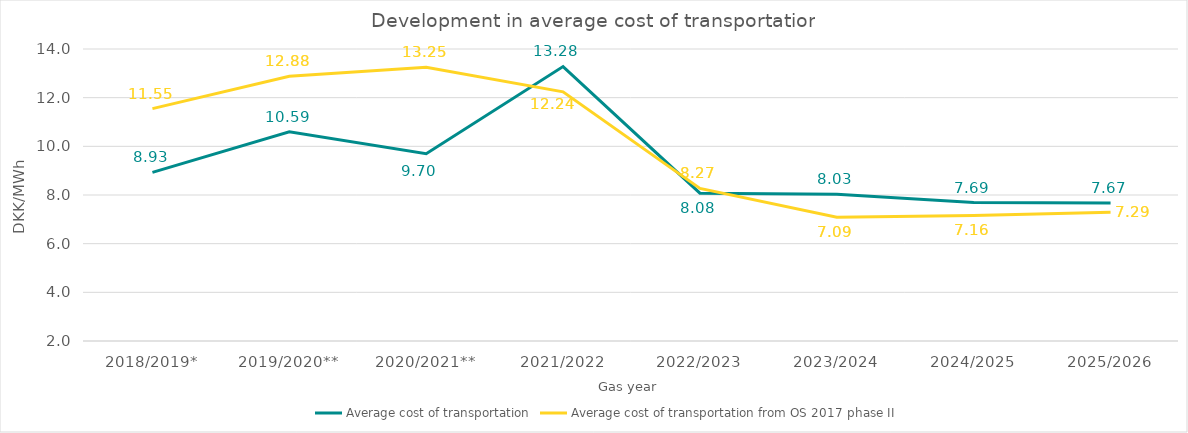
| Category | Average cost of transportation | Average cost of transportation from OS 2017 phase II |
|---|---|---|
| 2018/2019* | 8.93 | 11.55 |
| 2019/2020** | 10.595 | 12.88 |
| 2020/2021** | 9.696 | 13.25 |
| 2021/2022 | 13.277 | 12.24 |
| 2022/2023 | 8.075 | 8.27 |
| 2023/2024 | 8.026 | 7.09 |
| 2024/2025 | 7.691 | 7.16 |
| 2025/2026 | 7.671 | 7.29 |